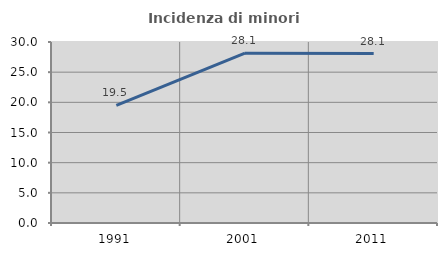
| Category | Incidenza di minori stranieri |
|---|---|
| 1991.0 | 19.512 |
| 2001.0 | 28.141 |
| 2011.0 | 28.086 |